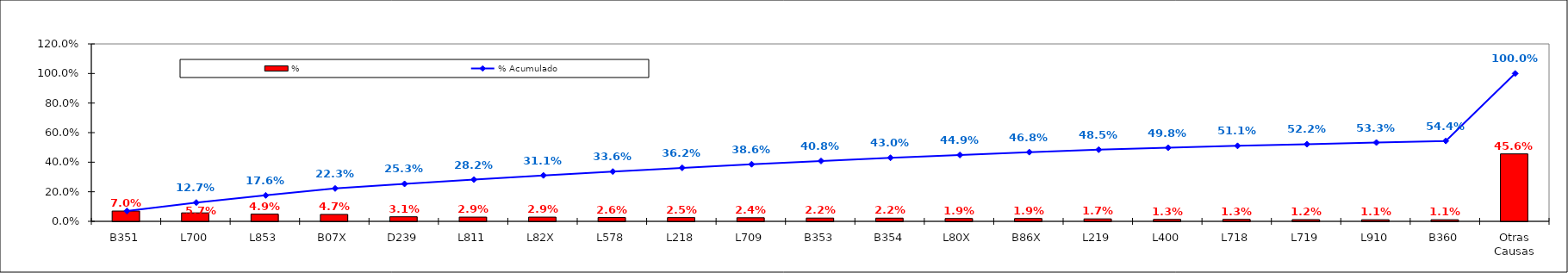
| Category | % |
|---|---|
| B351 | 0.07 |
| L700 | 0.057 |
| L853 | 0.049 |
| B07X | 0.047 |
| D239 | 0.031 |
| L811 | 0.029 |
| L82X | 0.029 |
| L578 | 0.026 |
| L218 | 0.025 |
| L709 | 0.024 |
| B353 | 0.022 |
| B354 | 0.022 |
| L80X | 0.019 |
| B86X | 0.019 |
| L219 | 0.017 |
| L400 | 0.013 |
| L718 | 0.013 |
| L719 | 0.012 |
| L910 | 0.011 |
| B360 | 0.011 |
| Otras Causas | 0.456 |